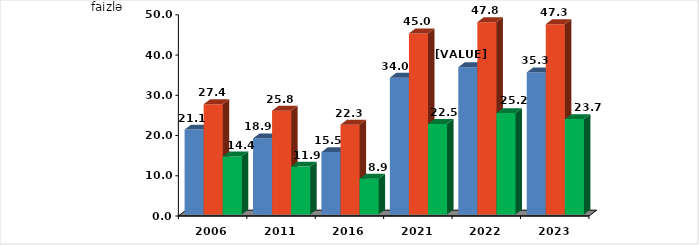
| Category | cəmi | şəhər yerləri | kənd yerləri |
|---|---|---|---|
| 2006.0 | 21.1 | 27.4 | 14.4 |
| 2011.0 | 18.9 | 25.8 | 11.9 |
| 2016.0 | 15.5 | 22.3 | 8.9 |
| 2021.0 | 34 | 45 | 22.5 |
| 2022.0 | 36.6 | 47.8 | 25.2 |
| 2023.0 | 35.3 | 47.3 | 23.7 |